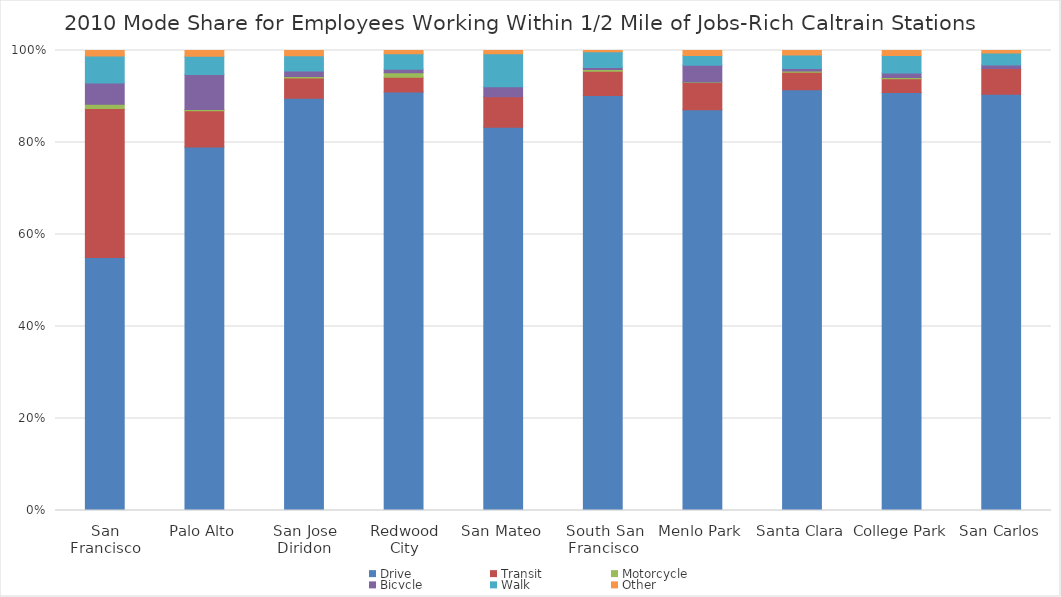
| Category | Drive | Transit | Motorcycle | Bicycle | Walk | Other |
|---|---|---|---|---|---|---|
| San Francisco | 0.55 | 0.324 | 0.009 | 0.046 | 0.059 | 0.012 |
| Palo Alto | 0.79 | 0.079 | 0.003 | 0.076 | 0.04 | 0.012 |
| San Jose Diridon | 0.896 | 0.044 | 0.003 | 0.012 | 0.033 | 0.011 |
| Redwood City | 0.91 | 0.032 | 0.01 | 0.007 | 0.034 | 0.007 |
| San Mateo | 0.833 | 0.067 | 0 | 0.021 | 0.072 | 0.007 |
| South San Francisco | 0.902 | 0.053 | 0.003 | 0.004 | 0.034 | 0.003 |
| Menlo Park | 0.871 | 0.059 | 0.001 | 0.036 | 0.021 | 0.011 |
| Santa Clara | 0.914 | 0.038 | 0.003 | 0.006 | 0.03 | 0.01 |
| College Park | 0.909 | 0.03 | 0.003 | 0.01 | 0.038 | 0.011 |
| San Carlos | 0.905 | 0.056 | 0 | 0.007 | 0.026 | 0.005 |